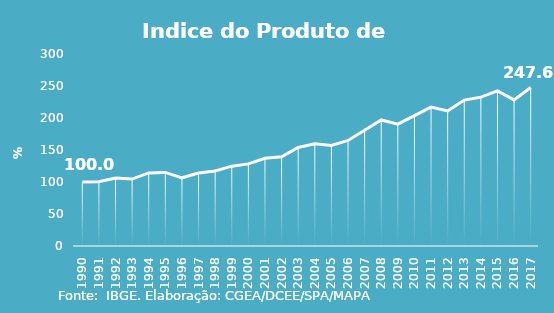
| Category | Indice de Prod. base 1990 |
|---|---|
| 1990.0 | 100 |
| 1991.0 | 100.275 |
| 1992.0 | 106.203 |
| 1993.0 | 104.57 |
| 1994.0 | 114.164 |
| 1995.0 | 115.024 |
| 1996.0 | 106.552 |
| 1997.0 | 114.037 |
| 1998.0 | 117.319 |
| 1999.0 | 124.734 |
| 2000.0 | 128.293 |
| 2001.0 | 136.975 |
| 2002.0 | 139.51 |
| 2003.0 | 153.868 |
| 2004.0 | 159.641 |
| 2005.0 | 157.136 |
| 2006.0 | 164.858 |
| 2007.0 | 180.781 |
| 2008.0 | 196.91 |
| 2009.0 | 190.309 |
| 2010.0 | 203.581 |
| 2011.0 | 217.041 |
| 2012.0 | 210.932 |
| 2013.0 | 228.009 |
| 2014.0 | 232.562 |
| 2015.0 | 242.318 |
| 2016.0 | 228.239 |
| 2017.0 | 247.569 |